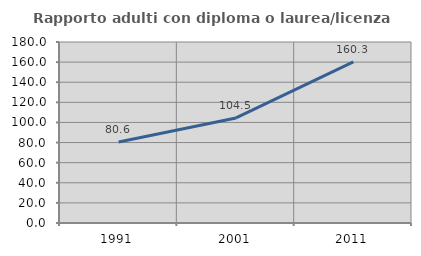
| Category | Rapporto adulti con diploma o laurea/licenza media  |
|---|---|
| 1991.0 | 80.582 |
| 2001.0 | 104.481 |
| 2011.0 | 160.272 |